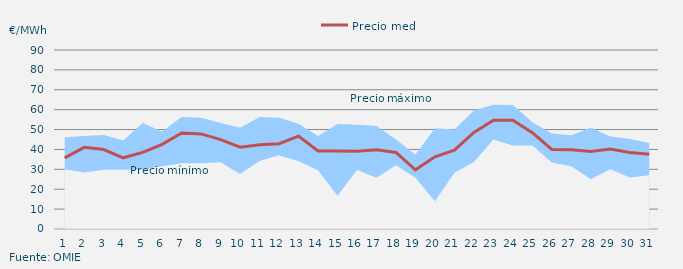
| Category | Precio medio |
|---|---|
| 1 | 35.732 |
| 2 | 41.04 |
| 3 | 39.969 |
| 4 | 35.792 |
| 5 | 38.55 |
| 6 | 42.54 |
| 7 | 48.269 |
| 8 | 47.821 |
| 9 | 44.927 |
| 10 | 41.105 |
| 11 | 42.349 |
| 12 | 42.858 |
| 13 | 46.717 |
| 14 | 39.206 |
| 15 | 39.18 |
| 16 | 39.053 |
| 17 | 39.804 |
| 18 | 38.465 |
| 19 | 29.781 |
| 20 | 36.313 |
| 21 | 39.631 |
| 22 | 48.521 |
| 23 | 54.715 |
| 24 | 54.716 |
| 25 | 48.439 |
| 26 | 40.015 |
| 27 | 39.809 |
| 28 | 38.944 |
| 29 | 40.245 |
| 30 | 38.504 |
| 31 | 37.592 |